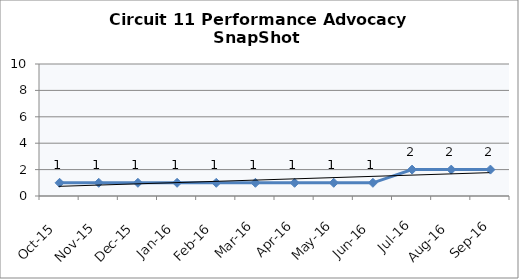
| Category | Circuit 11 |
|---|---|
| Oct-15 | 1 |
| Nov-15 | 1 |
| Dec-15 | 1 |
| Jan-16 | 1 |
| Feb-16 | 1 |
| Mar-16 | 1 |
| Apr-16 | 1 |
| May-16 | 1 |
| Jun-16 | 1 |
| Jul-16 | 2 |
| Aug-16 | 2 |
| Sep-16 | 2 |